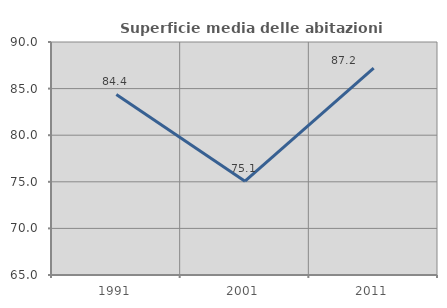
| Category | Superficie media delle abitazioni occupate |
|---|---|
| 1991.0 | 84.369 |
| 2001.0 | 75.068 |
| 2011.0 | 87.189 |